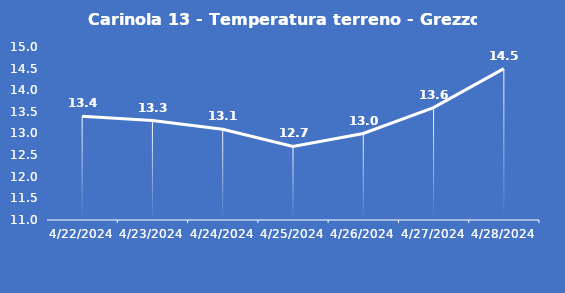
| Category | Carinola 13 - Temperatura terreno - Grezzo (°C) |
|---|---|
| 4/22/24 | 13.4 |
| 4/23/24 | 13.3 |
| 4/24/24 | 13.1 |
| 4/25/24 | 12.7 |
| 4/26/24 | 13 |
| 4/27/24 | 13.6 |
| 4/28/24 | 14.5 |